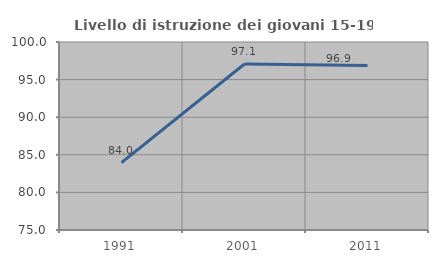
| Category | Livello di istruzione dei giovani 15-19 anni |
|---|---|
| 1991.0 | 83.967 |
| 2001.0 | 97.075 |
| 2011.0 | 96.88 |